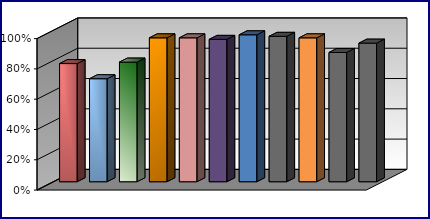
| Category | Series 0 | Series 1 | Series 2 | Series 3 |
|---|---|---|---|---|
| 0 | 0.78 |  |  |  |
| 1 | 0.68 |  |  |  |
| 2 | 0.79 |  |  |  |
| 3 | 0.95 |  |  |  |
| 4 | 0.95 |  |  |  |
| 5 | 0.94 |  |  |  |
| 6 | 0.97 |  |  |  |
| 7 | 0.96 |  |  |  |
| 8 | 0.95 |  |  |  |
| 9 | 0.853 |  |  |  |
| 10 | 0.915 |  |  |  |